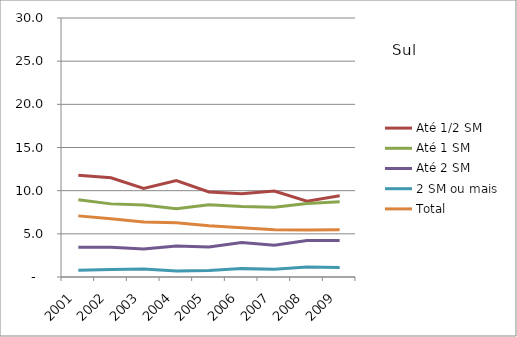
| Category | Até 1/2 SM | Até 1 SM | Até 2 SM | 2 SM ou mais | Total |
|---|---|---|---|---|---|
| 2001.0 | 11.78 | 8.94 | 3.44 | 0.79 | 7.08 |
| 2002.0 | 11.49 | 8.47 | 3.44 | 0.86 | 6.74 |
| 2003.0 | 10.26 | 8.33 | 3.24 | 0.93 | 6.38 |
| 2004.0 | 11.17 | 7.92 | 3.59 | 0.69 | 6.28 |
| 2005.0 | 9.85 | 8.38 | 3.47 | 0.76 | 5.93 |
| 2006.0 | 9.65 | 8.17 | 4 | 0.97 | 5.7 |
| 2007.0 | 9.96 | 8.08 | 3.68 | 0.89 | 5.47 |
| 2008.0 | 8.79 | 8.51 | 4.23 | 1.16 | 5.45 |
| 2009.0 | 9.4 | 8.71 | 4.24 | 1.1 | 5.46 |